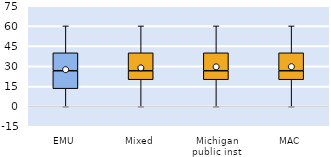
| Category | 25th | 50th | 75th |
|---|---|---|---|
| EMU | 13.333 | 13.333 | 13.333 |
| Mixed | 20 | 6.667 | 13.333 |
| Michigan public inst | 20 | 6.667 | 13.333 |
| MAC | 20 | 6.667 | 13.333 |